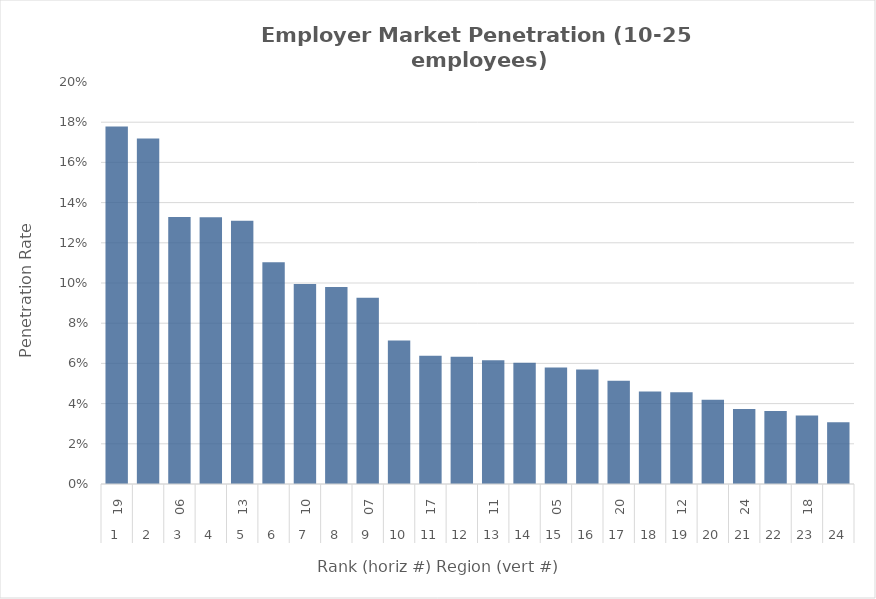
| Category | Rate |
|---|---|
| 0 | 0.178 |
| 1 | 0.172 |
| 2 | 0.133 |
| 3 | 0.133 |
| 4 | 0.131 |
| 5 | 0.11 |
| 6 | 0.1 |
| 7 | 0.098 |
| 8 | 0.093 |
| 9 | 0.071 |
| 10 | 0.064 |
| 11 | 0.063 |
| 12 | 0.062 |
| 13 | 0.06 |
| 14 | 0.058 |
| 15 | 0.057 |
| 16 | 0.051 |
| 17 | 0.046 |
| 18 | 0.046 |
| 19 | 0.042 |
| 20 | 0.037 |
| 21 | 0.036 |
| 22 | 0.034 |
| 23 | 0.031 |